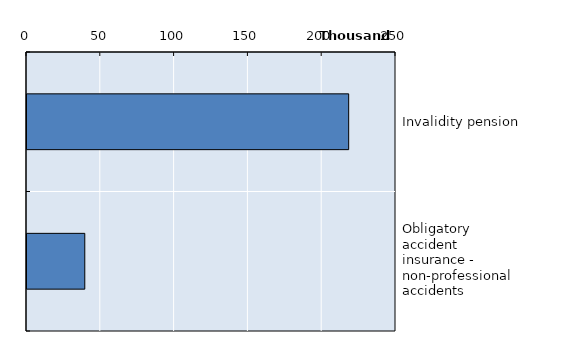
| Category | Series 0 |
|---|---|
| Invalidity pension | 217944 |
| Obligatory accident insurance - non-professional accidents | 39153 |